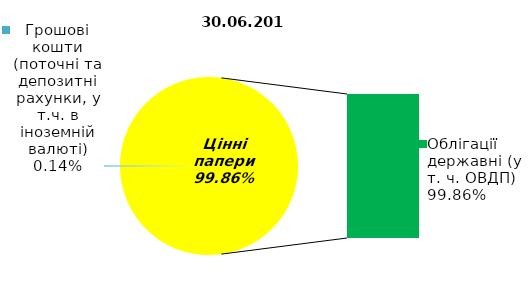
| Category | Series 0 |
|---|---|
| Грошові кошти (поточні та депозитні рахунки, у т.ч. в іноземній валюті) | 0.13 |
| Банківські метали | 0 |
| Нерухомість | 0 |
| Інші активи | 0 |
| Акції | 0 |
| Облігації підприємств | 0 |
| Муніципальні облігації | 0 |
| Облігації державні (у т. ч. ОВДП) | 92.62 |
| Іпотечні сертифікати | 0 |